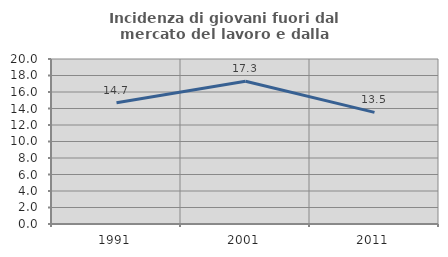
| Category | Incidenza di giovani fuori dal mercato del lavoro e dalla formazione  |
|---|---|
| 1991.0 | 14.69 |
| 2001.0 | 17.308 |
| 2011.0 | 13.534 |